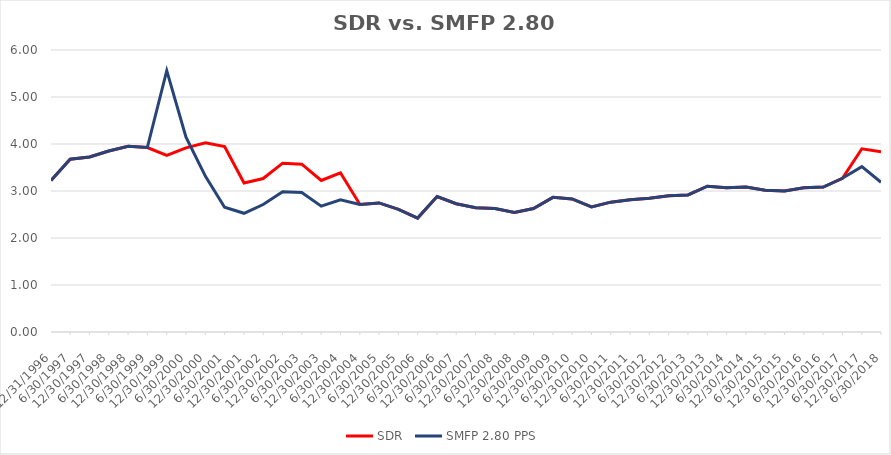
| Category | SDR | SMFP 2.80 PPS |
|---|---|---|
| 12/31/96 | 3.225 | 3.225 |
| 6/30/97 | 3.675 | 3.675 |
| 12/31/97 | 3.725 | 3.725 |
| 6/30/98 | 3.85 | 3.85 |
| 12/31/98 | 3.95 | 3.95 |
| 6/30/99 | 3.925 | 3.925 |
| 12/31/99 | 3.757 | 5.56 |
| 6/30/00 | 3.919 | 4.143 |
| 12/31/00 | 4.027 | 3.311 |
| 6/30/01 | 3.946 | 2.655 |
| 12/31/01 | 3.17 | 2.525 |
| 6/30/02 | 3.265 | 2.712 |
| 12/31/02 | 3.592 | 2.983 |
| 6/30/03 | 3.571 | 2.966 |
| 12/31/03 | 3.224 | 2.678 |
| 6/30/04 | 3.388 | 2.814 |
| 12/31/04 | 2.712 | 2.712 |
| 6/30/05 | 2.746 | 2.746 |
| 12/31/05 | 2.61 | 2.61 |
| 6/30/06 | 2.424 | 2.424 |
| 12/31/06 | 2.881 | 2.881 |
| 6/30/07 | 2.729 | 2.729 |
| 12/31/07 | 2.644 | 2.644 |
| 6/30/08 | 2.627 | 2.627 |
| 12/31/08 | 2.542 | 2.542 |
| 6/30/09 | 2.627 | 2.627 |
| 12/31/09 | 2.864 | 2.864 |
| 6/30/10 | 2.831 | 2.831 |
| 12/31/10 | 2.661 | 2.661 |
| 6/30/11 | 2.763 | 2.763 |
| 12/31/11 | 2.814 | 2.814 |
| 6/30/12 | 2.847 | 2.847 |
| 12/31/12 | 2.898 | 2.898 |
| 6/30/13 | 2.915 | 2.915 |
| 12/31/13 | 3.102 | 3.102 |
| 6/30/14 | 3.068 | 3.068 |
| 12/31/14 | 3.085 | 3.085 |
| 6/30/15 | 3.017 | 3.017 |
| 12/31/15 | 3 | 3 |
| 6/30/16 | 3.068 | 3.068 |
| 12/31/16 | 3.085 | 3.085 |
| 6/30/17 | 3.271 | 3.271 |
| 12/31/17 | 3.898 | 3.518 |
| 6/30/18 | 3.837 | 3.186 |